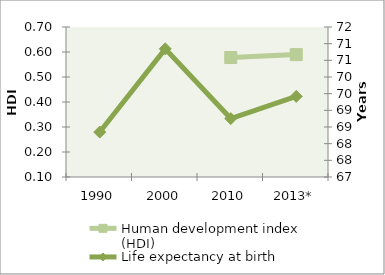
| Category | Human development index (HDI) |
|---|---|
| 1990 | 0 |
| 2000 | 0 |
| 2010 | 0.578 |
| 2013* | 0.59 |